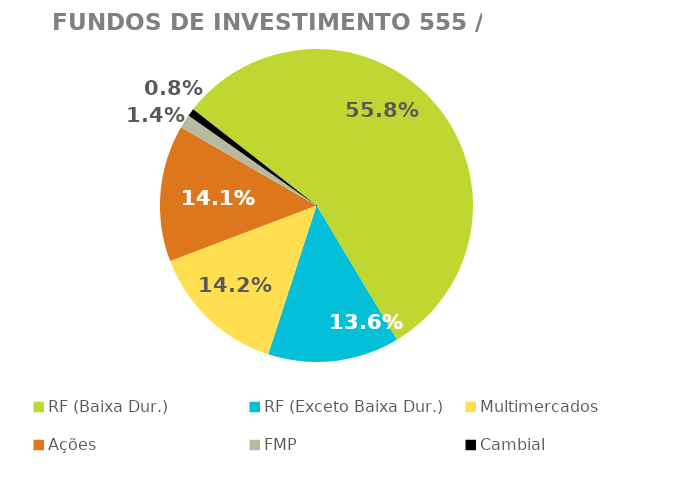
| Category | Fundos de Investimento 555 / FMP |
|---|---|
| RF (Baixa Dur.) | 0.558 |
| RF (Exceto Baixa Dur.) | 0.136 |
| Multimercados | 0.142 |
| Ações | 0.141 |
| FMP | 0.014 |
| Cambial | 0.008 |